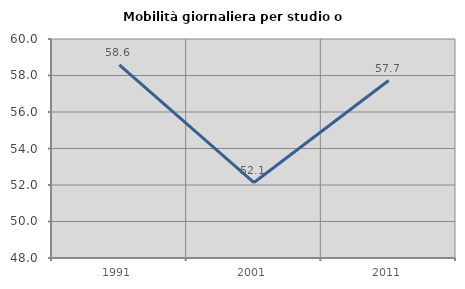
| Category | Mobilità giornaliera per studio o lavoro |
|---|---|
| 1991.0 | 58.579 |
| 2001.0 | 52.134 |
| 2011.0 | 57.726 |